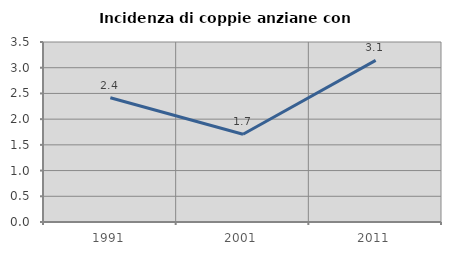
| Category | Incidenza di coppie anziane con figli |
|---|---|
| 1991.0 | 2.417 |
| 2001.0 | 1.707 |
| 2011.0 | 3.142 |